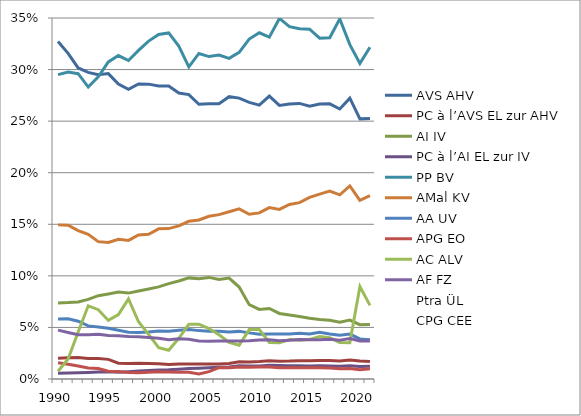
| Category | AVS | PC à l’AVS | AI | PC à l’AI | PP | AMal | AA | APG | AC | AF | Ptra | CPG |
|---|---|---|---|---|---|---|---|---|---|---|---|---|
| 1990.0 | 0.327 | 0.02 | 0.074 | 0.006 | 0.295 | 0.149 | 0.058 | 0.016 | 0.008 | 0.047 | 0 | 0 |
| 1991.0 | 0.316 | 0.021 | 0.074 | 0.006 | 0.298 | 0.149 | 0.058 | 0.014 | 0.019 | 0.045 | 0 | 0 |
| 1992.0 | 0.302 | 0.021 | 0.075 | 0.006 | 0.296 | 0.144 | 0.056 | 0.013 | 0.045 | 0.043 | 0 | 0 |
| 1993.0 | 0.297 | 0.02 | 0.077 | 0.006 | 0.283 | 0.14 | 0.051 | 0.011 | 0.071 | 0.043 | 0 | 0 |
| 1994.0 | 0.295 | 0.02 | 0.081 | 0.007 | 0.293 | 0.133 | 0.051 | 0.01 | 0.067 | 0.043 | 0 | 0 |
| 1995.0 | 0.296 | 0.019 | 0.083 | 0.007 | 0.307 | 0.132 | 0.049 | 0.008 | 0.057 | 0.042 | 0 | 0 |
| 1996.0 | 0.286 | 0.015 | 0.084 | 0.007 | 0.314 | 0.136 | 0.047 | 0.007 | 0.062 | 0.042 | 0 | 0 |
| 1997.0 | 0.281 | 0.015 | 0.083 | 0.007 | 0.309 | 0.134 | 0.045 | 0.006 | 0.078 | 0.041 | 0 | 0 |
| 1998.0 | 0.286 | 0.015 | 0.085 | 0.008 | 0.319 | 0.14 | 0.045 | 0.006 | 0.055 | 0.041 | 0 | 0 |
| 1999.0 | 0.286 | 0.015 | 0.087 | 0.008 | 0.328 | 0.14 | 0.045 | 0.007 | 0.043 | 0.04 | 0 | 0 |
| 2000.0 | 0.284 | 0.015 | 0.089 | 0.009 | 0.334 | 0.146 | 0.047 | 0.007 | 0.03 | 0.04 | 0 | 0 |
| 2001.0 | 0.284 | 0.014 | 0.092 | 0.009 | 0.336 | 0.146 | 0.046 | 0.007 | 0.028 | 0.038 | 0 | 0 |
| 2002.0 | 0.277 | 0.015 | 0.095 | 0.01 | 0.323 | 0.148 | 0.047 | 0.007 | 0.039 | 0.039 | 0 | 0 |
| 2003.0 | 0.276 | 0.014 | 0.098 | 0.01 | 0.303 | 0.153 | 0.048 | 0.006 | 0.053 | 0.039 | 0 | 0 |
| 2004.0 | 0.266 | 0.014 | 0.097 | 0.01 | 0.316 | 0.154 | 0.047 | 0.005 | 0.053 | 0.037 | 0 | 0 |
| 2005.0 | 0.267 | 0.014 | 0.099 | 0.011 | 0.313 | 0.158 | 0.046 | 0.007 | 0.049 | 0.037 | 0 | 0 |
| 2006.0 | 0.267 | 0.015 | 0.097 | 0.011 | 0.314 | 0.159 | 0.046 | 0.011 | 0.043 | 0.037 | 0 | 0 |
| 2007.0 | 0.274 | 0.015 | 0.098 | 0.012 | 0.311 | 0.162 | 0.045 | 0.011 | 0.035 | 0.037 | 0 | 0 |
| 2008.0 | 0.272 | 0.017 | 0.089 | 0.013 | 0.317 | 0.165 | 0.046 | 0.012 | 0.033 | 0.037 | 0 | 0 |
| 2009.0 | 0.268 | 0.017 | 0.072 | 0.013 | 0.33 | 0.16 | 0.045 | 0.012 | 0.048 | 0.037 | 0 | 0 |
| 2010.0 | 0.266 | 0.017 | 0.067 | 0.013 | 0.336 | 0.161 | 0.043 | 0.012 | 0.048 | 0.038 | 0 | 0 |
| 2011.0 | 0.274 | 0.018 | 0.068 | 0.013 | 0.331 | 0.166 | 0.044 | 0.012 | 0.035 | 0.038 | 0 | 0 |
| 2012.0 | 0.265 | 0.017 | 0.064 | 0.013 | 0.35 | 0.164 | 0.044 | 0.011 | 0.035 | 0.037 | 0 | 0 |
| 2013.0 | 0.267 | 0.017 | 0.062 | 0.013 | 0.342 | 0.169 | 0.044 | 0.011 | 0.038 | 0.038 | 0 | 0 |
| 2014.0 | 0.267 | 0.018 | 0.061 | 0.013 | 0.34 | 0.171 | 0.044 | 0.011 | 0.038 | 0.038 | 0 | 0 |
| 2015.0 | 0.264 | 0.018 | 0.059 | 0.013 | 0.339 | 0.176 | 0.044 | 0.011 | 0.038 | 0.038 | 0 | 0 |
| 2016.0 | 0.267 | 0.018 | 0.058 | 0.013 | 0.33 | 0.179 | 0.045 | 0.011 | 0.041 | 0.038 | 0 | 0 |
| 2017.0 | 0.267 | 0.018 | 0.057 | 0.013 | 0.331 | 0.182 | 0.044 | 0.011 | 0.04 | 0.039 | 0 | 0 |
| 2018.0 | 0.262 | 0.018 | 0.055 | 0.012 | 0.349 | 0.179 | 0.042 | 0.01 | 0.035 | 0.038 | 0 | 0 |
| 2019.0 | 0.272 | 0.018 | 0.057 | 0.013 | 0.324 | 0.187 | 0.044 | 0.01 | 0.035 | 0.039 | 0 | 0 |
| 2020.0 | 0.252 | 0.017 | 0.053 | 0.012 | 0.306 | 0.173 | 0.039 | 0.009 | 0.09 | 0.037 | 0 | 0.012 |
| 2021.0 | 0.253 | 0.017 | 0.053 | 0.012 | 0.322 | 0.178 | 0.038 | 0.01 | 0.071 | 0.037 | 0 | 0.01 |